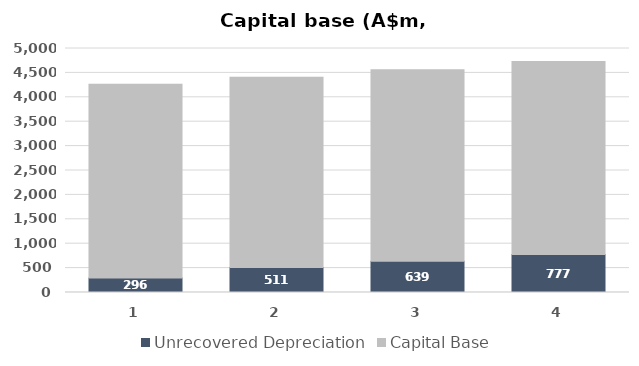
| Category | Unrecovered Depreciation | Capital Base |
|---|---|---|
| 2017.0 | 295.734 | 3973.262 |
| 2018.0 | 510.863 | 3902.361 |
| 2019.0 | 639.199 | 3926.254 |
| 2020.0 | 776.596 | 3957.364 |